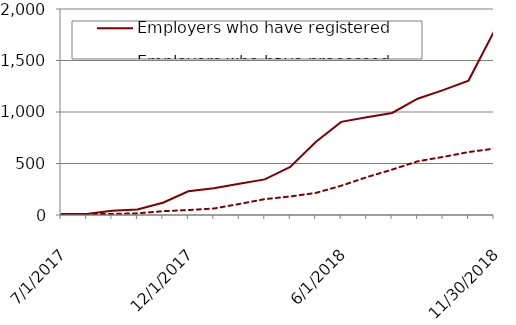
| Category | Employers who have registered | Employers who have processed payroll |
|---|---|---|
| 7/1/17 | 10 | 3 |
| nan | 10 | 9 |
| nan | 42 | 10 |
| nan | 53 | 16 |
| nan | 119 | 37 |
| 12/1/17 | 230 | 48 |
| nan | 260 | 63 |
| nan | 303 | 107 |
| nan | 346 | 154 |
| nan | 466 | 180 |
| nan | 708 | 214 |
| 6/1/18 | 904 | 284 |
| nan | 950 | 367 |
| nan | 991 | 441 |
| nan | 1129 | 521 |
| nan | 1212 | 564 |
| nan | 1305 | 611 |
| 11/30/18 | 1782 | 644 |